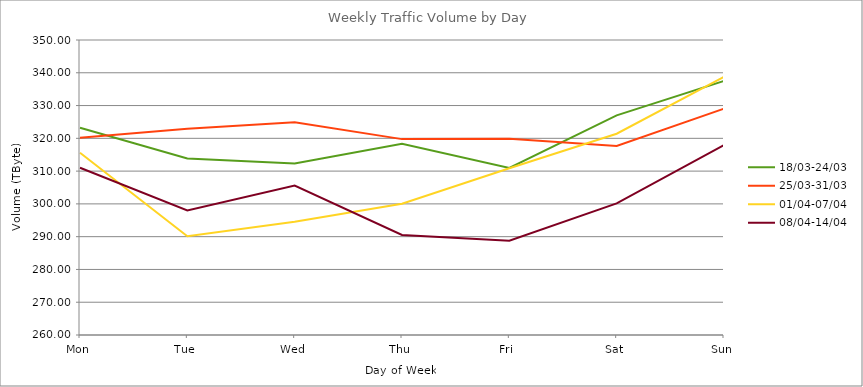
| Category | 18/03-24/03 | 25/03-31/03 | 01/04-07/04 | 08/04-14/04 |
|---|---|---|---|---|
| Mon | 323.24 | 320.21 | 315.61 | 311.02 |
| Tue | 313.88 | 322.96 | 290.14 | 297.97 |
| Wed | 312.33 | 324.88 | 294.56 | 305.62 |
| Thu | 318.35 | 319.76 | 300.04 | 290.52 |
| Fri | 310.99 | 319.85 | 310.87 | 288.75 |
| Sat | 326.99 | 317.68 | 321.4 | 300.14 |
| Sun | 337.53 | 329.05 | 338.73 | 317.97 |